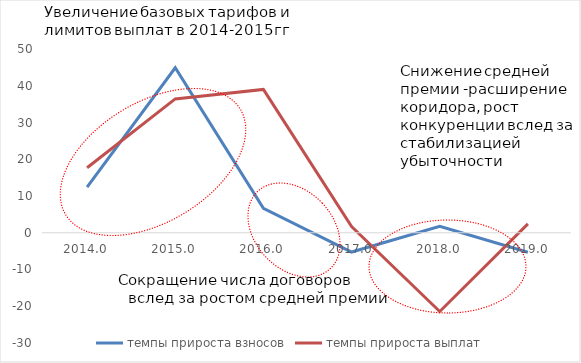
| Category | темпы прироста взносов | темпы прироста выплат |
|---|---|---|
| 2014.0 | 12.424 | 17.673 |
| 2015.0 | 44.9 | 36.416 |
| 2016.0 | 6.662 | 39 |
| 2017.0 | -5.245 | 1.663 |
| 2018.0 | 1.751 | -21.431 |
| 2019.0 | -5.3 | 2.4 |